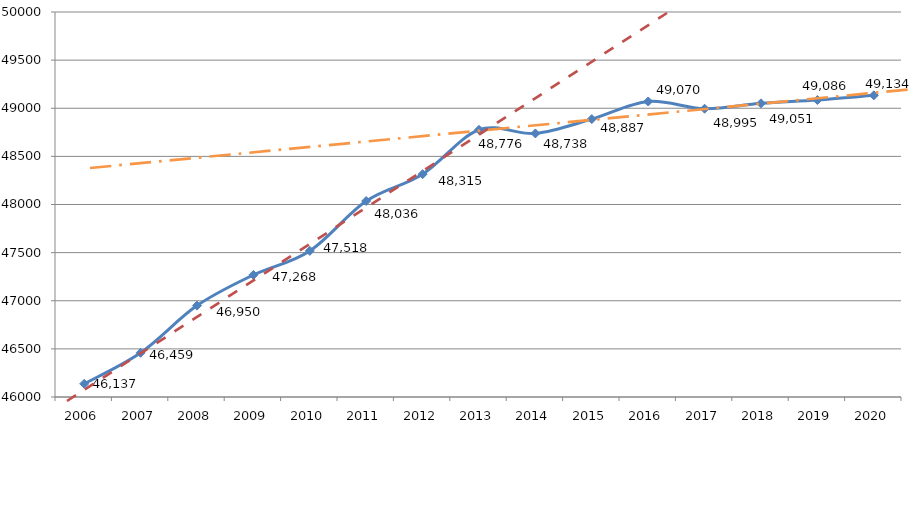
| Category | Series 0 |
|---|---|
| 2006.0 | 46137.08 |
| 2007.0 | 46459.089 |
| 2008.0 | 46949.54 |
| 2009.0 | 47268.13 |
| 2010.0 | 47518.06 |
| 2011.0 | 48036.07 |
| 2012.0 | 48315.05 |
| 2013.0 | 48776.47 |
| 2014.0 | 48738.4 |
| 2015.0 | 48887.38 |
| 2016.0 | 49070.22 |
| 2017.0 | 48995.18 |
| 2018.0 | 49051.24 |
| 2019.0 | 49085.55 |
| 2020.0 | 49133.95 |